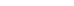
| Category | Series 0 |
|---|---|
| 0 | 1339.95 |